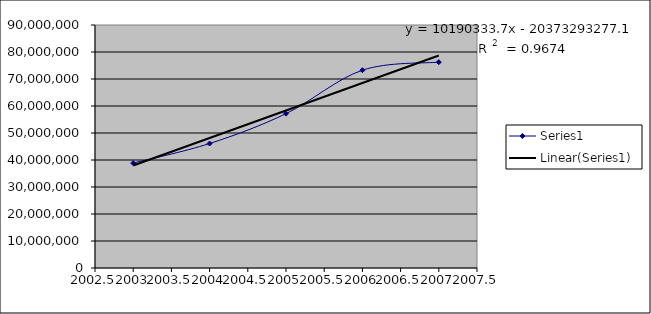
| Category | Series 0 |
|---|---|
| 2003.0 | 38863949 |
| 2004.0 | 46102914 |
| 2005.0 | 57160945 |
| 2006.0 | 73268149 |
| 2007.0 | 76233000 |